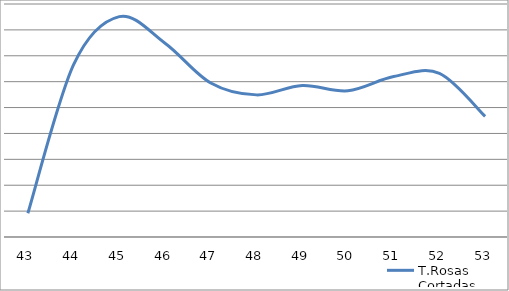
| Category | T.Rosas Cortadas |
|---|---|
| 43 | 9151 |
| 44 | 66549 |
| 45 | 85116 |
| 46 | 74846 |
| 47 | 59489 |
| 48 | 54898 |
| 49 | 58537 |
| 50 | 56493 |
| 51 | 61959 |
| 52 | 63226 |
| 53 | 46603 |